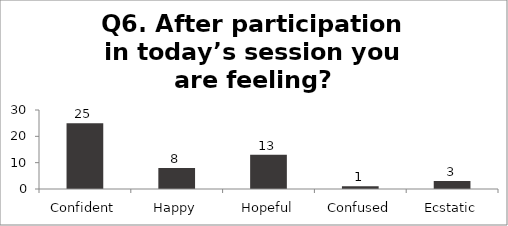
| Category | Q6. After participation in today’s session you are feeling? |
|---|---|
| Confident | 25 |
| Happy | 8 |
| Hopeful | 13 |
| Confused | 1 |
| Ecstatic | 3 |